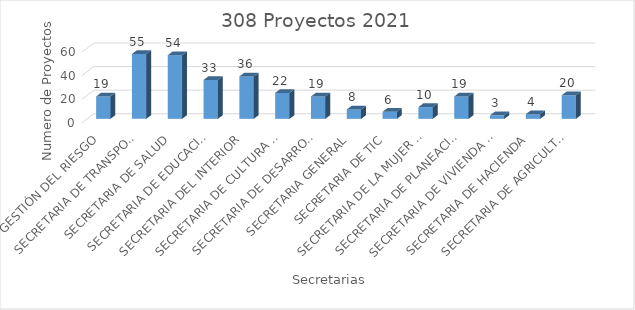
| Category | Series 0 |
|---|---|
| GESTIÓN DEL RIESGO | 19 |
| SECRETARIA DE TRANSPORTE E INFRAESTRUCTURA | 55 |
| SECRETARIA DE SALUD | 54 |
| SECRETARIA DE EDUCACION | 33 |
| SECRETARIA DEL INTERIOR | 36 |
| SECRETARIA DE CULTURA Y TURISMO | 22 |
| SECRETARIA DE DESARROLLO SOCIAL | 19 |
| SECRETARIA GENERAL | 8 |
| SECRETARIA DE TIC | 6 |
| SECRETARIA DE LA MUJER Y EQUIDAD DE GENERO | 10 |
| SECRETARIA DE PLANEACION | 19 |
| SECRETARIA DE VIVIENDA Y HABITAT SUSTENTABLE | 3 |
| SECRETARIA DE HACIENDA | 4 |
| SECRETARIA DE AGRICULTURA | 20 |